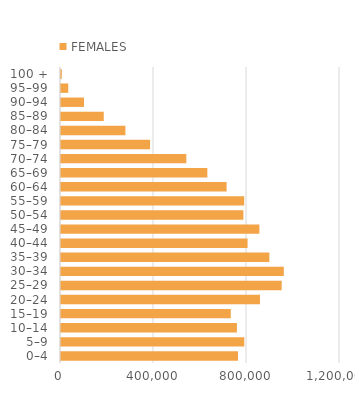
| Category |  FEMALES  |
|---|---|
| 100 + | 3594 |
| 95–99 | 31263 |
| 90–94 | 98860 |
| 85–89 | 183874 |
| 80–84 | 277194 |
| 75–79 | 383102 |
| 70–74 | 539049 |
| 65–69 | 629516 |
| 60–64 | 712292 |
| 55–59 | 787915 |
| 50–54 | 784453 |
| 45–49 | 853204 |
| 40–44 | 802459 |
| 35–39 | 896114 |
| 30–34 | 958311 |
| 25–29 | 949250 |
| 20–24 | 855976 |
| 15–19 | 730194 |
| 10–14 | 756623 |
| 5–9 | 788406 |
| 0–4 | 761351 |